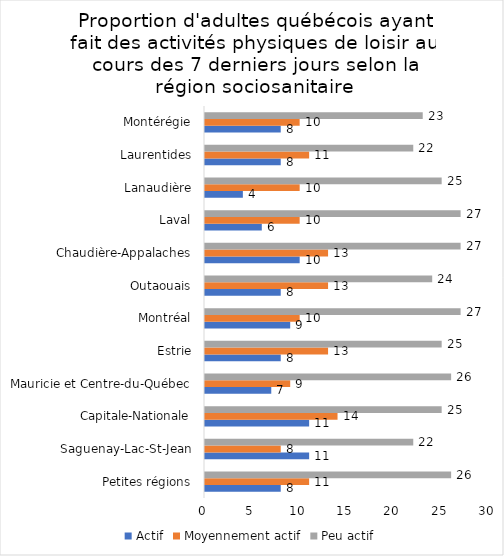
| Category | Actif | Moyennement actif | Peu actif |
|---|---|---|---|
| Petites régions | 8 | 11 | 26 |
| Saguenay-Lac-St-Jean | 11 | 8 | 22 |
| Capitale-Nationale | 11 | 14 | 25 |
| Mauricie et Centre-du-Québec | 7 | 9 | 26 |
| Estrie | 8 | 13 | 25 |
| Montréal | 9 | 10 | 27 |
| Outaouais | 8 | 13 | 24 |
| Chaudière-Appalaches | 10 | 13 | 27 |
| Laval | 6 | 10 | 27 |
| Lanaudière | 4 | 10 | 25 |
| Laurentides | 8 | 11 | 22 |
| Montérégie | 8 | 10 | 23 |